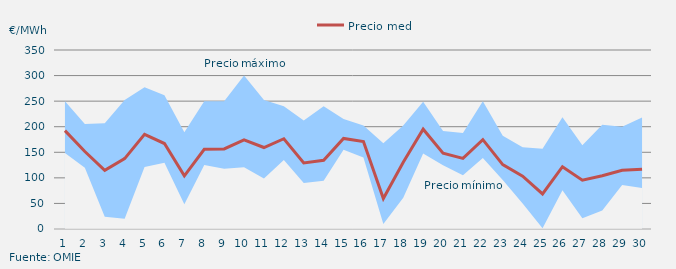
| Category | Precio medio |
|---|---|
| 1.0 | 192.4 |
| 2.0 | 151.492 |
| 3.0 | 114.718 |
| 4.0 | 137.687 |
| 5.0 | 185.231 |
| 6.0 | 167.15 |
| 7.0 | 103.891 |
| 8.0 | 155.959 |
| 9.0 | 156.624 |
| 10.0 | 174.297 |
| 11.0 | 159.328 |
| 12.0 | 176.517 |
| 13.0 | 129.02 |
| 14.0 | 134.398 |
| 15.0 | 177.135 |
| 16.0 | 170.898 |
| 17.0 | 59.683 |
| 18.0 | 130.648 |
| 19.0 | 195.156 |
| 20.0 | 148.409 |
| 21.0 | 138.165 |
| 22.0 | 174.819 |
| 23.0 | 125.834 |
| 24.0 | 103.405 |
| 25.0 | 68.502 |
| 26.0 | 121.823 |
| 27.0 | 95.305 |
| 28.0 | 104.067 |
| 29.0 | 114.82 |
| 30.0 | 116.977 |